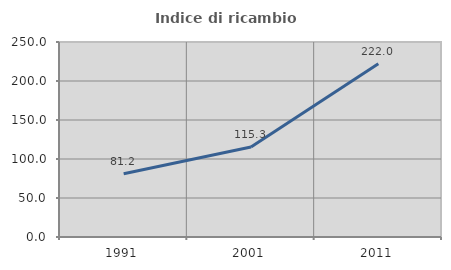
| Category | Indice di ricambio occupazionale  |
|---|---|
| 1991.0 | 81.163 |
| 2001.0 | 115.289 |
| 2011.0 | 222.034 |